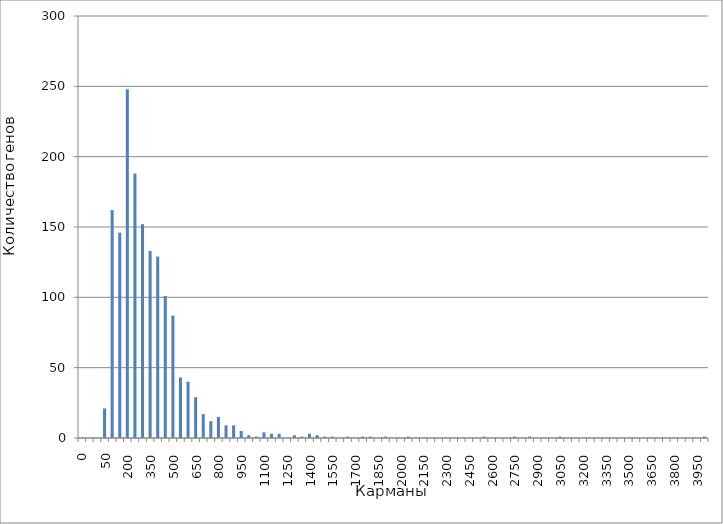
| Category | Series 0 |
|---|---|
| 0 | 0 |
| 10 | 0 |
| 25 | 0 |
| 50 | 21 |
| 100 | 162 |
| 150 | 146 |
| 200 | 248 |
| 250 | 188 |
| 300 | 152 |
| 350 | 133 |
| 400 | 129 |
| 450 | 101 |
| 500 | 87 |
| 550 | 43 |
| 600 | 40 |
| 650 | 29 |
| 700 | 17 |
| 750 | 12 |
| 800 | 15 |
| 850 | 9 |
| 900 | 9 |
| 950 | 5 |
| 1000 | 2 |
| 1050 | 1 |
| 1100 | 4 |
| 1150 | 3 |
| 1200 | 3 |
| 1250 | 0 |
| 1300 | 2 |
| 1350 | 1 |
| 1400 | 3 |
| 1450 | 2 |
| 1500 | 1 |
| 1550 | 1 |
| 1600 | 0 |
| 1650 | 1 |
| 1700 | 0 |
| 1750 | 1 |
| 1800 | 1 |
| 1850 | 0 |
| 1900 | 1 |
| 1950 | 0 |
| 2000 | 0 |
| 2050 | 1 |
| 2100 | 0 |
| 2150 | 0 |
| 2200 | 0 |
| 2250 | 0 |
| 2300 | 0 |
| 2350 | 0 |
| 2400 | 0 |
| 2450 | 0 |
| 2500 | 0 |
| 2550 | 1 |
| 2600 | 0 |
| 2650 | 0 |
| 2700 | 0 |
| 2750 | 1 |
| 2800 | 0 |
| 2850 | 1 |
| 2900 | 0 |
| 2950 | 0 |
| 3000 | 0 |
| 3050 | 1 |
| 3100 | 0 |
| 3150 | 0 |
| 3200 | 0 |
| 3250 | 0 |
| 3300 | 0 |
| 3350 | 0 |
| 3400 | 0 |
| 3450 | 0 |
| 3500 | 0 |
| 3550 | 0 |
| 3600 | 0 |
| 3650 | 0 |
| 3700 | 0 |
| 3750 | 0 |
| 3800 | 0 |
| 3850 | 0 |
| 3900 | 0 |
| 3950 | 0 |
| 4000 | 1 |